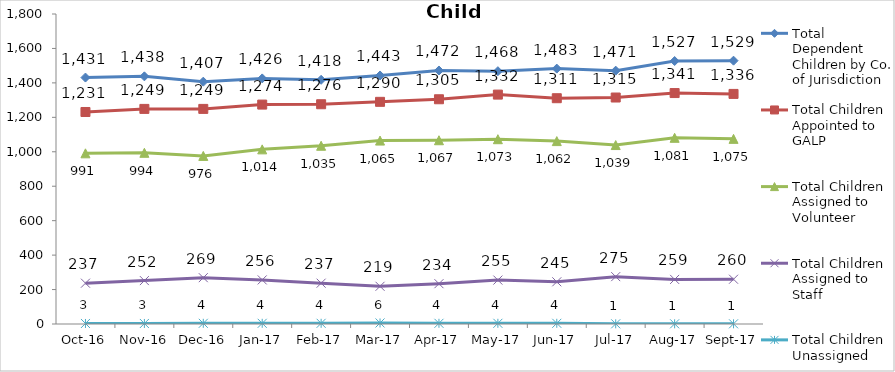
| Category | Total Dependent Children by Co. of Jurisdiction | Total Children Appointed to GALP | Total Children Assigned to Volunteer | Total Children Assigned to Staff | Total Children Unassigned |
|---|---|---|---|---|---|
| 2016-10-01 | 1431 | 1231 | 991 | 237 | 3 |
| 2016-11-01 | 1438 | 1249 | 994 | 252 | 3 |
| 2016-12-01 | 1407 | 1249 | 976 | 269 | 4 |
| 2017-01-01 | 1426 | 1274 | 1014 | 256 | 4 |
| 2017-02-01 | 1418 | 1276 | 1035 | 237 | 4 |
| 2017-03-01 | 1443 | 1290 | 1065 | 219 | 6 |
| 2017-04-01 | 1472 | 1305 | 1067 | 234 | 4 |
| 2017-05-01 | 1468 | 1332 | 1073 | 255 | 4 |
| 2017-06-01 | 1483 | 1311 | 1062 | 245 | 4 |
| 2017-07-01 | 1471 | 1315 | 1039 | 275 | 1 |
| 2017-08-01 | 1527 | 1341 | 1081 | 259 | 1 |
| 2017-09-01 | 1529 | 1336 | 1075 | 260 | 1 |